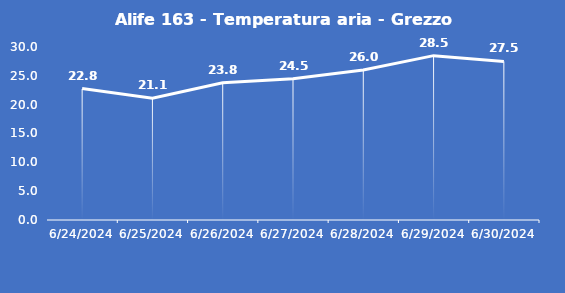
| Category | Alife 163 - Temperatura aria - Grezzo (°C) |
|---|---|
| 6/24/24 | 22.8 |
| 6/25/24 | 21.1 |
| 6/26/24 | 23.8 |
| 6/27/24 | 24.5 |
| 6/28/24 | 26 |
| 6/29/24 | 28.5 |
| 6/30/24 | 27.5 |